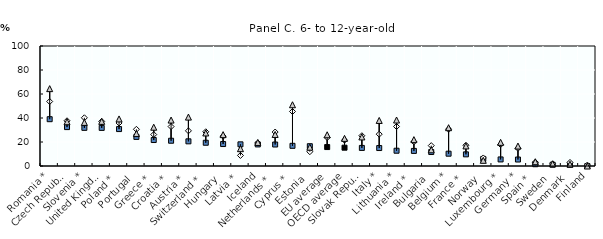
| Category | 1st tertile (lowest) | 2nd tertile | 3rd tertile (highest) |
|---|---|---|---|
| Romania * | 39.002 | 53.74 | 64.467 |
| Czech Republic | 32.418 | 37.688 | 36.852 |
| Slovenia * | 31.79 | 40.178 | 36.327 |
| United Kingdom | 31.757 | 37.137 | 37.193 |
| Poland * | 30.779 | 35.875 | 39.22 |
| Portugal | 24.235 | 30.585 | 27.017 |
| Greece * | 21.649 | 26.188 | 32.328 |
| Croatia * | 21.05 | 32.866 | 38.274 |
| Austria * | 20.547 | 29.302 | 40.757 |
| Switzerland * | 19.365 | 28.523 | 27.532 |
| Hungary | 18.298 | 24.833 | 26.137 |
| Latvia * | 18.051 | 8.794 | 14.429 |
| Iceland | 17.976 | 19.159 | 19.643 |
| Netherlands * | 17.898 | 28.294 | 26.3 |
| Cyprus * | 16.816 | 45.435 | 51.043 |
| Estonia | 16.498 | 11.904 | 15.679 |
| EU average | 15.785 | 23.717 | 26.027 |
| OECD average | 15.265 | 21.506 | 23.019 |
| Slovak Republic * | 15.072 | 25.225 | 24.227 |
| Italy * | 14.971 | 26.528 | 37.962 |
| Lithuania * | 12.729 | 32.9 | 38.318 |
| Ireland * | 12.577 | 20.177 | 21.974 |
| Bulgaria | 11.642 | 16.97 | 13.511 |
| Belgium * | 10.255 | 30.695 | 31.916 |
| France * | 9.704 | 17.295 | 16.731 |
| Norway | 5.89 | 6.704 | 4.73 |
| Luxembourg * | 5.475 | 17.836 | 19.707 |
| Germany * | 5.396 | 14.742 | 16.627 |
| Spain * | 1.473 | 3.12 | 3.562 |
| Sweden | 1.074 | 1.733 | 1.843 |
| Denmark | 1.016 | 2.972 | 1.486 |
| Finland | 0 | 0.757 | 0 |